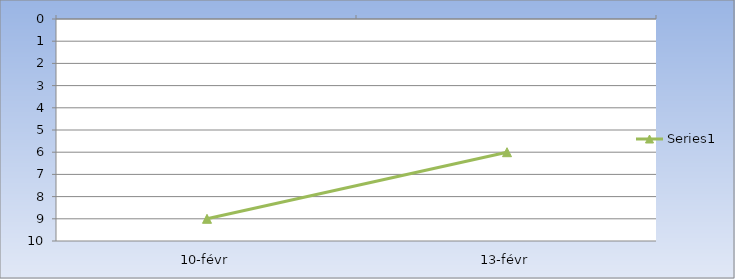
| Category | Series 2 |
|---|---|
| 10-févr | 9 |
| 13-févr | 6 |